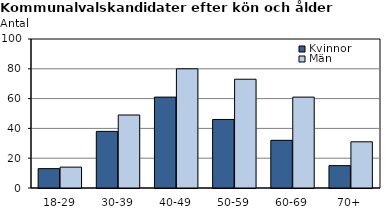
| Category | Kvinnor | Män |
|---|---|---|
| 18-29 | 13 | 14 |
| 30-39 | 38 | 49 |
| 40-49 | 61 | 80 |
| 50-59 | 46 | 73 |
| 60-69 | 32 | 61 |
| 70+ | 15 | 31 |